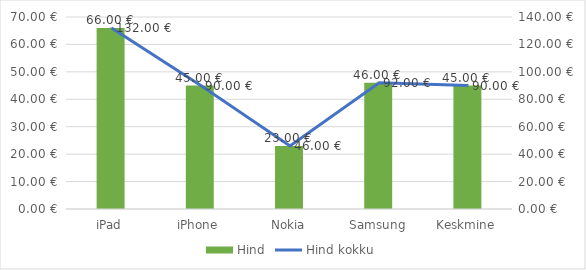
| Category | Hind |
|---|---|
| iPad | 66 |
| iPhone | 45 |
| Nokia | 23 |
| Samsung | 46 |
| Keskmine | 45 |